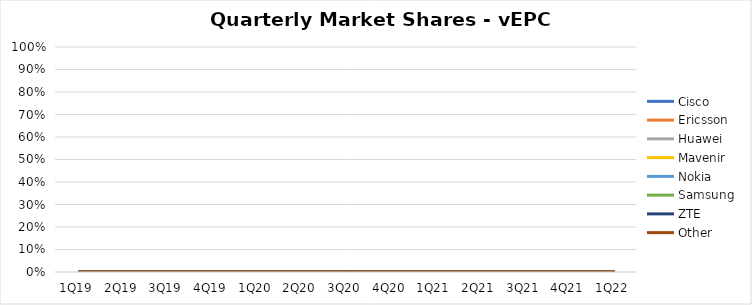
| Category | Cisco | Ericsson | Huawei | Mavenir | Nokia | Samsung | ZTE | Other |
|---|---|---|---|---|---|---|---|---|
| 1Q19 | 0 | 0 | 0 | 0 | 0 | 0 | 0 | 0 |
| 2Q19 | 0 | 0 | 0 | 0 | 0 | 0 | 0 | 0 |
| 3Q19 | 0 | 0 | 0 | 0 | 0 | 0 | 0 | 0 |
| 4Q19 | 0 | 0 | 0 | 0 | 0 | 0 | 0 | 0 |
| 1Q20 | 0 | 0 | 0 | 0 | 0 | 0 | 0 | 0 |
| 2Q20 | 0 | 0 | 0 | 0 | 0 | 0 | 0 | 0 |
| 3Q20 | 0 | 0 | 0 | 0 | 0 | 0 | 0 | 0 |
| 4Q20 | 0 | 0 | 0 | 0 | 0 | 0 | 0 | 0 |
| 1Q21 | 0 | 0 | 0 | 0 | 0 | 0 | 0 | 0 |
| 2Q21 | 0 | 0 | 0 | 0 | 0 | 0 | 0 | 0 |
| 3Q21 | 0 | 0 | 0 | 0 | 0 | 0 | 0 | 0 |
| 4Q21 | 0 | 0 | 0 | 0 | 0 | 0 | 0 | 0 |
| 1Q22 | 0 | 0 | 0 | 0 | 0 | 0 | 0 | 0 |